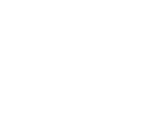
| Category | Series 0 |
|---|---|
| Available | 8294.62 |
| Picked | 0 |